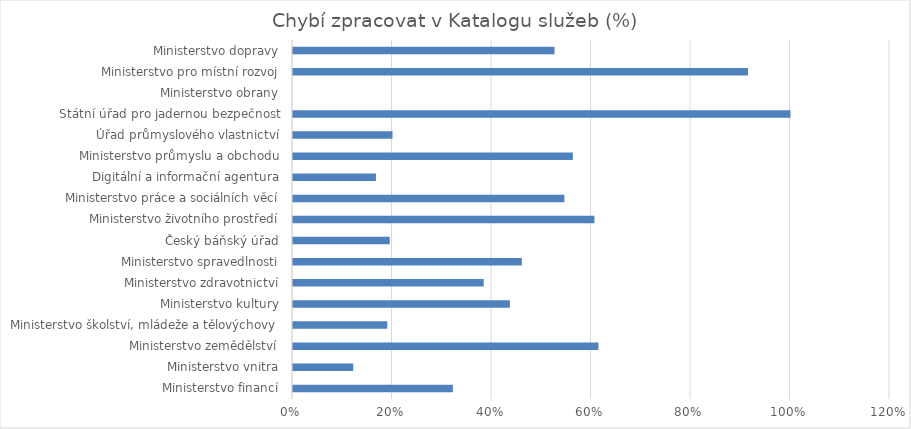
| Category | Chybí zpracovat v Katalogu služeb (%) |
|---|---|
| Ministerstvo financí | 0.321 |
| Ministerstvo vnitra | 0.121 |
| Ministerstvo zemědělství | 0.614 |
| Ministerstvo školství, mládeže a tělovýchovy | 0.189 |
| Ministerstvo kultury | 0.436 |
| Ministerstvo zdravotnictví | 0.383 |
| Ministerstvo spravedlnosti | 0.46 |
| Český báňský úřad | 0.194 |
| Ministerstvo životního prostředí | 0.606 |
| Ministerstvo práce a sociálních věcí | 0.545 |
| Digitální a informační agentura | 0.167 |
| Ministerstvo průmyslu a obchodu | 0.562 |
| Úřad průmyslového vlastnictví | 0.2 |
| Státní úřad pro jadernou bezpečnost | 1 |
| Ministerstvo obrany | 0 |
| Ministerstvo pro místní rozvoj | 0.914 |
| Ministerstvo dopravy | 0.526 |